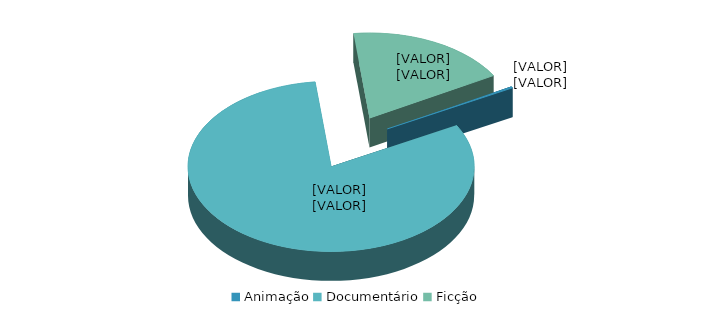
| Category | 1 | Series 1 |
|---|---|---|
| Animação | 1 | 0.003 |
| Documentário | 273 | 0.812 |
| Ficção | 62 | 0.185 |